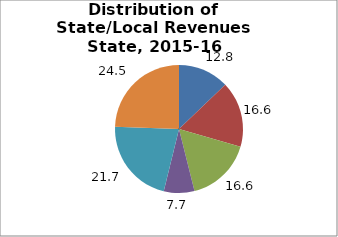
| Category | Series 0 |
|---|---|
| General Sales | 12.85 |
| Property | 16.641 |
| Income₁ | 16.618 |
| Other | 7.73 |
| From Federal Government | 21.711 |
| Nontax Revenues₂ | 24.45 |